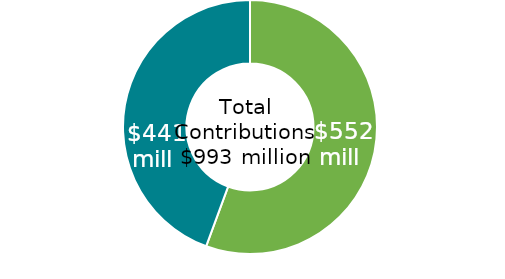
| Category | Series 0 |
|---|---|
| Union | 552.411 |
| Non-Union | 441.031 |